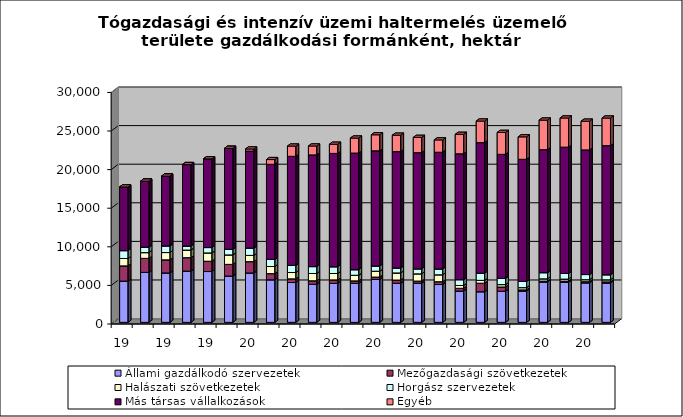
| Category | Állami gazdálkodó szervezetek | Mezőgazdasági szövetkezetek | Halászati szövetkezetek | Horgász szervezetek | Más társas vállalkozások | Egyéb  |
|---|---|---|---|---|---|---|
| 1995. | 5347 | 1972 | 956 | 1018 | 8252 | 0 |
| 1996. | 6478 | 1816 | 742 | 716 | 8544 | 0 |
| 1997. | 6404 | 1700 | 943 | 857 | 9043 | 0 |
| 1998. | 6637 | 1745 | 987 | 515 | 10557 | 0 |
| 1999. | 6587 | 1335 | 1074 | 696 | 11494 | 0 |
| 2000. | 5999 | 1516 | 1225 | 735 | 13072 | 0 |
| 2001. | 6401 | 1468 | 807 | 952 | 12566 | 268 |
| 2002. | 5514 | 803 | 920 | 922 | 12320 | 611 |
| 2003. | 5162 | 478 | 820 | 921 | 14128 | 1330 |
| 2004. | 4935 | 455 | 942 | 895 | 14467 | 1157 |
| 2005. | 5050 | 455 | 827 | 872 | 14683 | 1191 |
| 2006. | 5054 | 322 | 728 | 720 | 15108 | 1946 |
| 2007. | 5559 | 312 | 759 | 671 | 14927 | 2075 |
| 2008. | 5071 | 414 | 918 | 639 | 15083 | 2123 |
| 2009. | 5073 | 279 | 935 | 642 | 15059 | 1980 |
| 2010. | 4903 | 367 | 894 | 752 | 15126 | 1597 |
| 2011. | 4053 | 363 | 362 | 752 | 16308 | 2525 |
| 2012. | 3968 | 1108 | 366 | 928 | 16920 | 2792 |
| 2013. | 4032 | 552 | 310 | 808 | 16067 | 2839 |
| 2014. | 4054 | 157 | 290 | 811 | 15814 | 2909 |
| 2015. | 5234 | 116 | 290 | 799 | 15938 | 3830 |
| 2016. | 5197 | 151 | 260 | 731 | 16362 | 3779 |
| 2017. | 5118 | 151 | 261 | 667 | 16143 | 3725 |
| 2018. | 5097 | 151 | 266 | 652 | 16732 | 3575 |